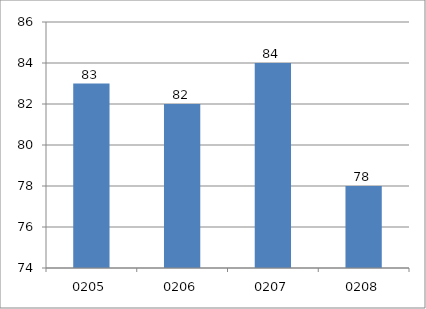
| Category | Series 0 |
|---|---|
| 205.0 | 83 |
| 206.0 | 82 |
| 207.0 | 84 |
| 208.0 | 78 |